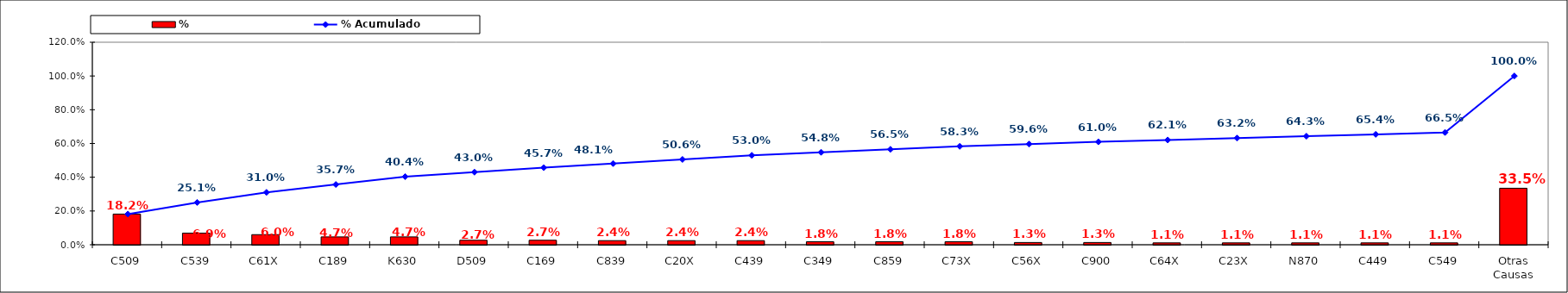
| Category | % |
|---|---|
| C509 | 0.182 |
| C539 | 0.069 |
| C61X | 0.06 |
| C189 | 0.047 |
| K630 | 0.047 |
| D509 | 0.027 |
| C169 | 0.027 |
| C839 | 0.024 |
| C20X | 0.024 |
| C439 | 0.024 |
| C349 | 0.018 |
| C859 | 0.018 |
| C73X | 0.018 |
| C56X | 0.013 |
| C900 | 0.013 |
| C64X | 0.011 |
| C23X | 0.011 |
| N870 | 0.011 |
| C449 | 0.011 |
| C549 | 0.011 |
| Otras Causas | 0.335 |